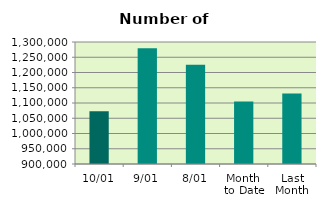
| Category | Series 0 |
|---|---|
| 10/01 | 1072896 |
| 9/01 | 1279918 |
| 8/01 | 1225644 |
| Month 
to Date | 1104538 |
| Last
Month | 1131500.526 |